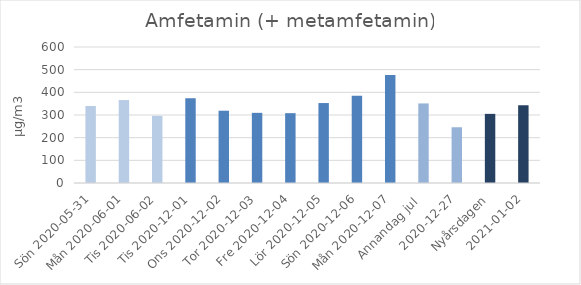
| Category | Amfetamin (+ metamfetamin) |
|---|---|
| Sön 2020-05-31 | 339.6 |
| Mån 2020-06-01 | 365.9 |
|  Tis 2020-06-02 | 296.3 |
| Tis 2020-12-01 | 373.9 |
| Ons 2020-12-02 | 318.9 |
| Tor 2020-12-03 | 309.5 |
| Fre 2020-12-04 | 308.1 |
| Lör 2020-12-05 | 352.7 |
| Sön 2020-12-06 | 385.3 |
| Mån 2020-12-07 | 476.3 |
| Annandag jul  | 351 |
| 2020-12-27 | 246 |
| Nyårsdagen | 305 |
| 2021-01-02 | 343 |